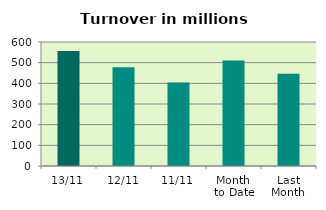
| Category | Series 0 |
|---|---|
| 13/11 | 556.101 |
| 12/11 | 477.632 |
| 11/11 | 404.284 |
| Month 
to Date | 510.359 |
| Last
Month | 446.481 |